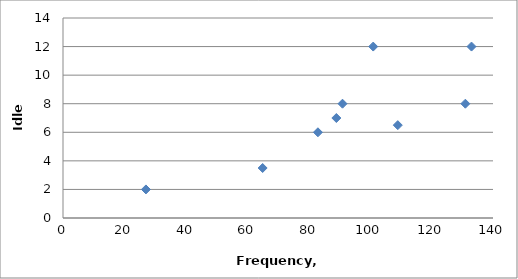
| Category | Idle Amps |
|---|---|
| 27.0 | 2 |
| 65.0 | 3.5 |
| 83.0 | 6 |
| 109.0 | 6.5 |
| 89.0 | 7 |
| 91.0 | 8 |
| 131.0 | 8 |
| 133.0 | 12 |
| 101.0 | 12 |